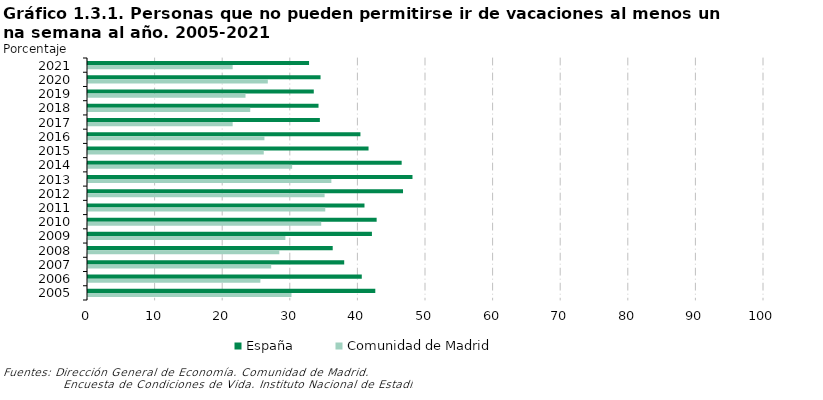
| Category | España | Comunidad de Madrid |
|---|---|---|
| 2021 | 32.7 | 21.4 |
| 2020 | 34.4 | 26.6 |
| 2019 | 33.4 | 23.3 |
| 2018 | 34.1 | 24 |
| 2017 | 34.3 | 21.4 |
| 2016 | 40.3 | 26.1 |
| 2015 | 41.5 | 26 |
| 2014 | 46.4 | 30.2 |
| 2013 | 48 | 36 |
| 2012 | 46.6 | 35 |
| 2011 | 40.9 | 35.1 |
| 2010 | 42.7 | 34.5 |
| 2009 | 42 | 29.2 |
| 2008 | 36.2 | 28.3 |
| 2007 | 37.9 | 27.1 |
| 2006 | 40.5 | 25.5 |
| 2005 | 42.5 | 30.1 |